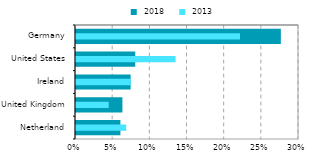
| Category |  2018 |
|---|---|
| Netherland | 0.06 |
| United Kingdom | 0.062 |
| Ireland | 0.073 |
| United States | 0.08 |
| Germany | 0.276 |